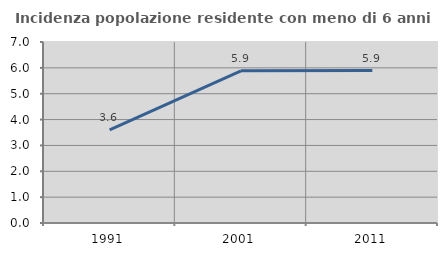
| Category | Incidenza popolazione residente con meno di 6 anni |
|---|---|
| 1991.0 | 3.6 |
| 2001.0 | 5.885 |
| 2011.0 | 5.896 |